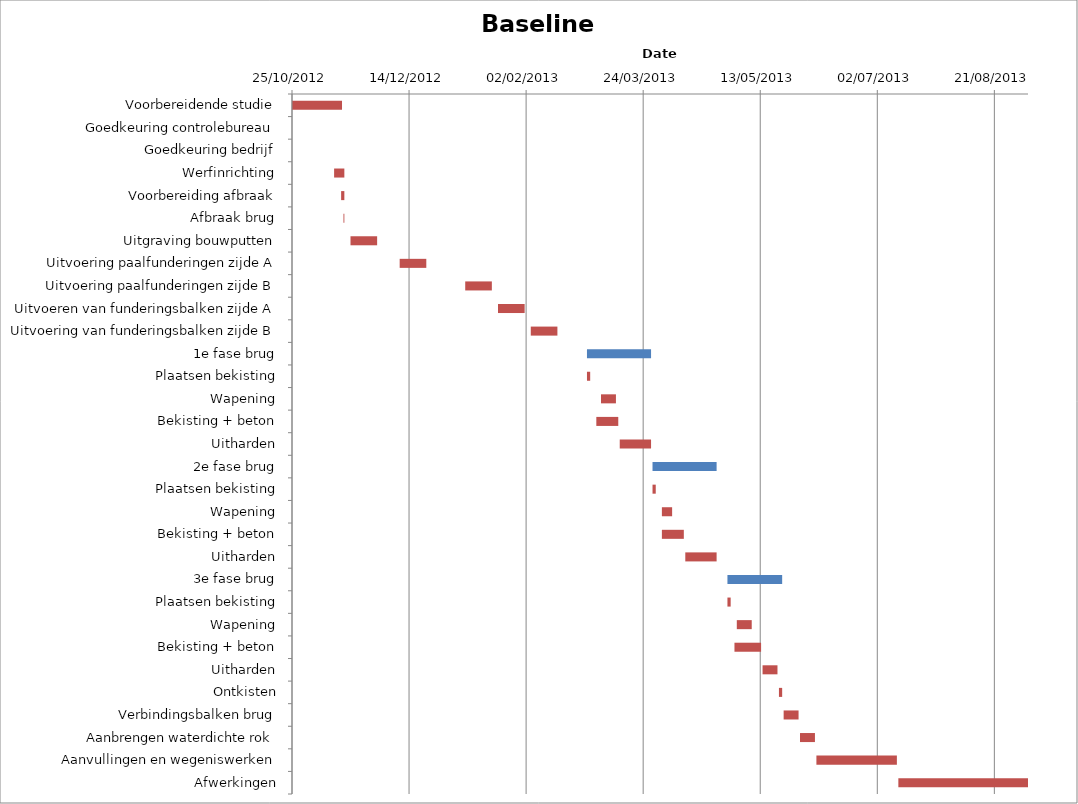
| Category | Baseline start | Actual duration |
|---|---|---|
| Voorbereidende studie | 41207.292 | 21.375 |
| Goedkeuring controlebureau | 41234.667 | 0 |
| Goedkeuring bedrijf | 41241.667 | 0 |
| Werfinrichting | 41225.292 | 4.375 |
| Voorbereiding afbraak | 41228.292 | 1.375 |
| Afbraak brug | 41229.292 | 0.375 |
| Uitgraving bouwputten | 41232.292 | 11.375 |
| Uitvoering paalfunderingen zijde A | 41253.292 | 11.375 |
| Uitvoering paalfunderingen zijde B | 41281.292 | 11.375 |
| Uitvoeren van funderingsbalken zijde A | 41295.292 | 11.375 |
| Uitvoering van funderingsbalken zijde B | 41309.292 | 11.375 |
| 1e fase brug | 41333.292 | 27.375 |
| Plaatsen bekisting | 41333.292 | 1.375 |
| Wapening | 41339.292 | 6.375 |
| Bekisting + beton | 41337.292 | 9.375 |
| Uitharden | 41347.292 | 13.375 |
| 2e fase brug | 41361.292 | 27.375 |
| Plaatsen bekisting | 41361.292 | 1.375 |
| Wapening | 41365.292 | 4.375 |
| Bekisting + beton | 41365.292 | 9.375 |
| Uitharden | 41375.292 | 13.375 |
| 3e fase brug | 41393.292 | 23.375 |
| Plaatsen bekisting | 41393.292 | 1.375 |
| Wapening | 41397.292 | 6.375 |
| Bekisting + beton | 41396.292 | 11.375 |
| Uitharden | 41408.292 | 6.375 |
| Ontkisten | 41415.292 | 1.375 |
| Verbindingsbalken brug | 41417.292 | 6.375 |
| Aanbrengen waterdichte rok | 41424.292 | 6.375 |
| Aanvullingen en wegeniswerken | 41431.292 | 34.375 |
| Afwerkingen | 41466.292 | 55.375 |